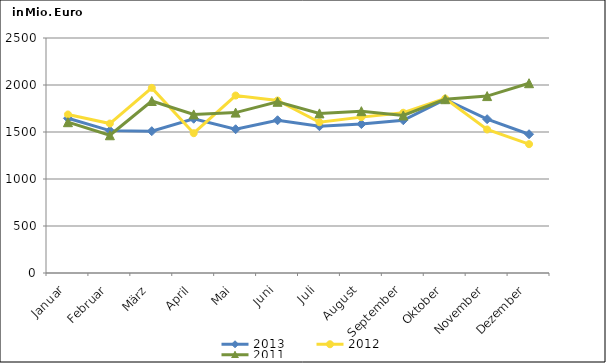
| Category | 2013 | 2012 | 2011 |
|---|---|---|---|
| Januar | 1645.618 | 1686.373 | 1604.367 |
| Februar | 1514.603 | 1589.998 | 1465.42 |
| März | 1508.683 | 1969.441 | 1829.772 |
| April | 1641.027 | 1487.262 | 1687.063 |
| Mai | 1529.369 | 1887.848 | 1706.592 |
| Juni | 1624.951 | 1835.079 | 1821.363 |
| Juli | 1561.548 | 1604.071 | 1698.085 |
| August | 1584.449 | 1658.161 | 1721.458 |
| September | 1624.959 | 1704.746 | 1676.037 |
| Oktober | 1846.311 | 1855.892 | 1848.981 |
| November | 1636.355 | 1526.57 | 1882.135 |
| Dezember | 1476.287 | 1370.533 | 2018.975 |